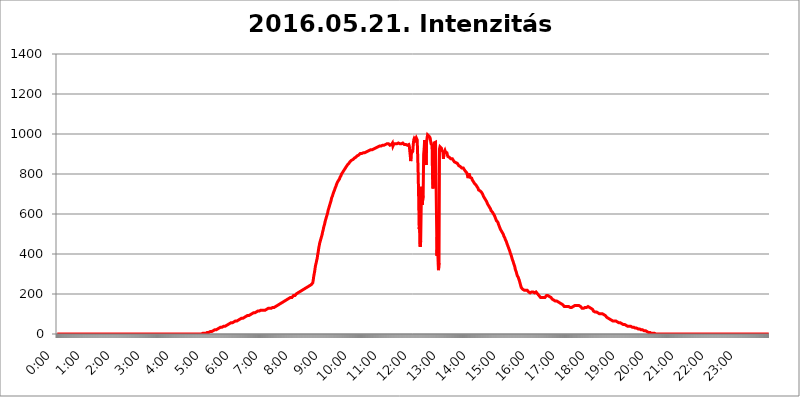
| Category | 2016.05.21. Intenzitás [W/m^2] |
|---|---|
| 0.0 | 0 |
| 0.0006944444444444445 | 0 |
| 0.001388888888888889 | 0 |
| 0.0020833333333333333 | 0 |
| 0.002777777777777778 | 0 |
| 0.003472222222222222 | 0 |
| 0.004166666666666667 | 0 |
| 0.004861111111111111 | 0 |
| 0.005555555555555556 | 0 |
| 0.0062499999999999995 | 0 |
| 0.006944444444444444 | 0 |
| 0.007638888888888889 | 0 |
| 0.008333333333333333 | 0 |
| 0.009027777777777779 | 0 |
| 0.009722222222222222 | 0 |
| 0.010416666666666666 | 0 |
| 0.011111111111111112 | 0 |
| 0.011805555555555555 | 0 |
| 0.012499999999999999 | 0 |
| 0.013194444444444444 | 0 |
| 0.013888888888888888 | 0 |
| 0.014583333333333332 | 0 |
| 0.015277777777777777 | 0 |
| 0.015972222222222224 | 0 |
| 0.016666666666666666 | 0 |
| 0.017361111111111112 | 0 |
| 0.018055555555555557 | 0 |
| 0.01875 | 0 |
| 0.019444444444444445 | 0 |
| 0.02013888888888889 | 0 |
| 0.020833333333333332 | 0 |
| 0.02152777777777778 | 0 |
| 0.022222222222222223 | 0 |
| 0.02291666666666667 | 0 |
| 0.02361111111111111 | 0 |
| 0.024305555555555556 | 0 |
| 0.024999999999999998 | 0 |
| 0.025694444444444447 | 0 |
| 0.02638888888888889 | 0 |
| 0.027083333333333334 | 0 |
| 0.027777777777777776 | 0 |
| 0.02847222222222222 | 0 |
| 0.029166666666666664 | 0 |
| 0.029861111111111113 | 0 |
| 0.030555555555555555 | 0 |
| 0.03125 | 0 |
| 0.03194444444444445 | 0 |
| 0.03263888888888889 | 0 |
| 0.03333333333333333 | 0 |
| 0.034027777777777775 | 0 |
| 0.034722222222222224 | 0 |
| 0.035416666666666666 | 0 |
| 0.036111111111111115 | 0 |
| 0.03680555555555556 | 0 |
| 0.0375 | 0 |
| 0.03819444444444444 | 0 |
| 0.03888888888888889 | 0 |
| 0.03958333333333333 | 0 |
| 0.04027777777777778 | 0 |
| 0.04097222222222222 | 0 |
| 0.041666666666666664 | 0 |
| 0.042361111111111106 | 0 |
| 0.04305555555555556 | 0 |
| 0.043750000000000004 | 0 |
| 0.044444444444444446 | 0 |
| 0.04513888888888889 | 0 |
| 0.04583333333333334 | 0 |
| 0.04652777777777778 | 0 |
| 0.04722222222222222 | 0 |
| 0.04791666666666666 | 0 |
| 0.04861111111111111 | 0 |
| 0.049305555555555554 | 0 |
| 0.049999999999999996 | 0 |
| 0.05069444444444445 | 0 |
| 0.051388888888888894 | 0 |
| 0.052083333333333336 | 0 |
| 0.05277777777777778 | 0 |
| 0.05347222222222222 | 0 |
| 0.05416666666666667 | 0 |
| 0.05486111111111111 | 0 |
| 0.05555555555555555 | 0 |
| 0.05625 | 0 |
| 0.05694444444444444 | 0 |
| 0.057638888888888885 | 0 |
| 0.05833333333333333 | 0 |
| 0.05902777777777778 | 0 |
| 0.059722222222222225 | 0 |
| 0.06041666666666667 | 0 |
| 0.061111111111111116 | 0 |
| 0.06180555555555556 | 0 |
| 0.0625 | 0 |
| 0.06319444444444444 | 0 |
| 0.06388888888888888 | 0 |
| 0.06458333333333334 | 0 |
| 0.06527777777777778 | 0 |
| 0.06597222222222222 | 0 |
| 0.06666666666666667 | 0 |
| 0.06736111111111111 | 0 |
| 0.06805555555555555 | 0 |
| 0.06874999999999999 | 0 |
| 0.06944444444444443 | 0 |
| 0.07013888888888889 | 0 |
| 0.07083333333333333 | 0 |
| 0.07152777777777779 | 0 |
| 0.07222222222222223 | 0 |
| 0.07291666666666667 | 0 |
| 0.07361111111111111 | 0 |
| 0.07430555555555556 | 0 |
| 0.075 | 0 |
| 0.07569444444444444 | 0 |
| 0.0763888888888889 | 0 |
| 0.07708333333333334 | 0 |
| 0.07777777777777778 | 0 |
| 0.07847222222222222 | 0 |
| 0.07916666666666666 | 0 |
| 0.0798611111111111 | 0 |
| 0.08055555555555556 | 0 |
| 0.08125 | 0 |
| 0.08194444444444444 | 0 |
| 0.08263888888888889 | 0 |
| 0.08333333333333333 | 0 |
| 0.08402777777777777 | 0 |
| 0.08472222222222221 | 0 |
| 0.08541666666666665 | 0 |
| 0.08611111111111112 | 0 |
| 0.08680555555555557 | 0 |
| 0.08750000000000001 | 0 |
| 0.08819444444444445 | 0 |
| 0.08888888888888889 | 0 |
| 0.08958333333333333 | 0 |
| 0.09027777777777778 | 0 |
| 0.09097222222222222 | 0 |
| 0.09166666666666667 | 0 |
| 0.09236111111111112 | 0 |
| 0.09305555555555556 | 0 |
| 0.09375 | 0 |
| 0.09444444444444444 | 0 |
| 0.09513888888888888 | 0 |
| 0.09583333333333333 | 0 |
| 0.09652777777777777 | 0 |
| 0.09722222222222222 | 0 |
| 0.09791666666666667 | 0 |
| 0.09861111111111111 | 0 |
| 0.09930555555555555 | 0 |
| 0.09999999999999999 | 0 |
| 0.10069444444444443 | 0 |
| 0.1013888888888889 | 0 |
| 0.10208333333333335 | 0 |
| 0.10277777777777779 | 0 |
| 0.10347222222222223 | 0 |
| 0.10416666666666667 | 0 |
| 0.10486111111111111 | 0 |
| 0.10555555555555556 | 0 |
| 0.10625 | 0 |
| 0.10694444444444444 | 0 |
| 0.1076388888888889 | 0 |
| 0.10833333333333334 | 0 |
| 0.10902777777777778 | 0 |
| 0.10972222222222222 | 0 |
| 0.1111111111111111 | 0 |
| 0.11180555555555556 | 0 |
| 0.11180555555555556 | 0 |
| 0.1125 | 0 |
| 0.11319444444444444 | 0 |
| 0.11388888888888889 | 0 |
| 0.11458333333333333 | 0 |
| 0.11527777777777777 | 0 |
| 0.11597222222222221 | 0 |
| 0.11666666666666665 | 0 |
| 0.1173611111111111 | 0 |
| 0.11805555555555557 | 0 |
| 0.11944444444444445 | 0 |
| 0.12013888888888889 | 0 |
| 0.12083333333333333 | 0 |
| 0.12152777777777778 | 0 |
| 0.12222222222222223 | 0 |
| 0.12291666666666667 | 0 |
| 0.12291666666666667 | 0 |
| 0.12361111111111112 | 0 |
| 0.12430555555555556 | 0 |
| 0.125 | 0 |
| 0.12569444444444444 | 0 |
| 0.12638888888888888 | 0 |
| 0.12708333333333333 | 0 |
| 0.16875 | 0 |
| 0.12847222222222224 | 0 |
| 0.12916666666666668 | 0 |
| 0.12986111111111112 | 0 |
| 0.13055555555555556 | 0 |
| 0.13125 | 0 |
| 0.13194444444444445 | 0 |
| 0.1326388888888889 | 0 |
| 0.13333333333333333 | 0 |
| 0.13402777777777777 | 0 |
| 0.13402777777777777 | 0 |
| 0.13472222222222222 | 0 |
| 0.13541666666666666 | 0 |
| 0.1361111111111111 | 0 |
| 0.13749999999999998 | 0 |
| 0.13819444444444443 | 0 |
| 0.1388888888888889 | 0 |
| 0.13958333333333334 | 0 |
| 0.14027777777777778 | 0 |
| 0.14097222222222222 | 0 |
| 0.14166666666666666 | 0 |
| 0.1423611111111111 | 0 |
| 0.14305555555555557 | 0 |
| 0.14375000000000002 | 0 |
| 0.14444444444444446 | 0 |
| 0.1451388888888889 | 0 |
| 0.1451388888888889 | 0 |
| 0.14652777777777778 | 0 |
| 0.14722222222222223 | 0 |
| 0.14791666666666667 | 0 |
| 0.1486111111111111 | 0 |
| 0.14930555555555555 | 0 |
| 0.15 | 0 |
| 0.15069444444444444 | 0 |
| 0.15138888888888888 | 0 |
| 0.15208333333333332 | 0 |
| 0.15277777777777776 | 0 |
| 0.15347222222222223 | 0 |
| 0.15416666666666667 | 0 |
| 0.15486111111111112 | 0 |
| 0.15555555555555556 | 0 |
| 0.15625 | 0 |
| 0.15694444444444444 | 0 |
| 0.15763888888888888 | 0 |
| 0.15833333333333333 | 0 |
| 0.15902777777777777 | 0 |
| 0.15972222222222224 | 0 |
| 0.16041666666666668 | 0 |
| 0.16111111111111112 | 0 |
| 0.16180555555555556 | 0 |
| 0.1625 | 0 |
| 0.16319444444444445 | 0 |
| 0.1638888888888889 | 0 |
| 0.16458333333333333 | 0 |
| 0.16527777777777777 | 0 |
| 0.16597222222222222 | 0 |
| 0.16666666666666666 | 0 |
| 0.1673611111111111 | 0 |
| 0.16805555555555554 | 0 |
| 0.16874999999999998 | 0 |
| 0.16944444444444443 | 0 |
| 0.17013888888888887 | 0 |
| 0.1708333333333333 | 0 |
| 0.17152777777777775 | 0 |
| 0.17222222222222225 | 0 |
| 0.1729166666666667 | 0 |
| 0.17361111111111113 | 0 |
| 0.17430555555555557 | 0 |
| 0.17500000000000002 | 0 |
| 0.17569444444444446 | 0 |
| 0.1763888888888889 | 0 |
| 0.17708333333333334 | 0 |
| 0.17777777777777778 | 0 |
| 0.17847222222222223 | 0 |
| 0.17916666666666667 | 0 |
| 0.1798611111111111 | 0 |
| 0.18055555555555555 | 0 |
| 0.18125 | 0 |
| 0.18194444444444444 | 0 |
| 0.1826388888888889 | 0 |
| 0.18333333333333335 | 0 |
| 0.1840277777777778 | 0 |
| 0.18472222222222223 | 0 |
| 0.18541666666666667 | 0 |
| 0.18611111111111112 | 0 |
| 0.18680555555555556 | 0 |
| 0.1875 | 0 |
| 0.18819444444444444 | 0 |
| 0.18888888888888888 | 0 |
| 0.18958333333333333 | 0 |
| 0.19027777777777777 | 0 |
| 0.1909722222222222 | 0 |
| 0.19166666666666665 | 0 |
| 0.19236111111111112 | 0 |
| 0.19305555555555554 | 0 |
| 0.19375 | 0 |
| 0.19444444444444445 | 0 |
| 0.1951388888888889 | 0 |
| 0.19583333333333333 | 0 |
| 0.19652777777777777 | 0 |
| 0.19722222222222222 | 0 |
| 0.19791666666666666 | 0 |
| 0.1986111111111111 | 0 |
| 0.19930555555555554 | 0 |
| 0.19999999999999998 | 0 |
| 0.20069444444444443 | 0 |
| 0.20138888888888887 | 0 |
| 0.2020833333333333 | 0 |
| 0.2027777777777778 | 0 |
| 0.2034722222222222 | 3.525 |
| 0.2041666666666667 | 3.525 |
| 0.20486111111111113 | 3.525 |
| 0.20555555555555557 | 3.525 |
| 0.20625000000000002 | 3.525 |
| 0.20694444444444446 | 3.525 |
| 0.2076388888888889 | 3.525 |
| 0.20833333333333334 | 3.525 |
| 0.20902777777777778 | 3.525 |
| 0.20972222222222223 | 3.525 |
| 0.21041666666666667 | 7.887 |
| 0.2111111111111111 | 7.887 |
| 0.21180555555555555 | 7.887 |
| 0.2125 | 7.887 |
| 0.21319444444444444 | 7.887 |
| 0.2138888888888889 | 12.257 |
| 0.21458333333333335 | 12.257 |
| 0.2152777777777778 | 12.257 |
| 0.21597222222222223 | 12.257 |
| 0.21666666666666667 | 12.257 |
| 0.21736111111111112 | 12.257 |
| 0.21805555555555556 | 16.636 |
| 0.21875 | 16.636 |
| 0.21944444444444444 | 16.636 |
| 0.22013888888888888 | 16.636 |
| 0.22083333333333333 | 21.024 |
| 0.22152777777777777 | 21.024 |
| 0.2222222222222222 | 21.024 |
| 0.22291666666666665 | 21.024 |
| 0.2236111111111111 | 21.024 |
| 0.22430555555555556 | 25.419 |
| 0.225 | 25.419 |
| 0.22569444444444445 | 25.419 |
| 0.2263888888888889 | 29.823 |
| 0.22708333333333333 | 29.823 |
| 0.22777777777777777 | 29.823 |
| 0.22847222222222222 | 29.823 |
| 0.22916666666666666 | 34.234 |
| 0.2298611111111111 | 34.234 |
| 0.23055555555555554 | 34.234 |
| 0.23124999999999998 | 34.234 |
| 0.23194444444444443 | 38.653 |
| 0.23263888888888887 | 38.653 |
| 0.2333333333333333 | 38.653 |
| 0.2340277777777778 | 38.653 |
| 0.2347222222222222 | 38.653 |
| 0.2354166666666667 | 38.653 |
| 0.23611111111111113 | 43.079 |
| 0.23680555555555557 | 43.079 |
| 0.23750000000000002 | 43.079 |
| 0.23819444444444446 | 47.511 |
| 0.2388888888888889 | 47.511 |
| 0.23958333333333334 | 47.511 |
| 0.24027777777777778 | 47.511 |
| 0.24097222222222223 | 47.511 |
| 0.24166666666666667 | 51.951 |
| 0.2423611111111111 | 51.951 |
| 0.24305555555555555 | 56.398 |
| 0.24375 | 56.398 |
| 0.24444444444444446 | 56.398 |
| 0.24513888888888888 | 56.398 |
| 0.24583333333333335 | 56.398 |
| 0.2465277777777778 | 60.85 |
| 0.24722222222222223 | 60.85 |
| 0.24791666666666667 | 60.85 |
| 0.24861111111111112 | 60.85 |
| 0.24930555555555556 | 65.31 |
| 0.25 | 65.31 |
| 0.25069444444444444 | 65.31 |
| 0.2513888888888889 | 65.31 |
| 0.2520833333333333 | 65.31 |
| 0.25277777777777777 | 69.775 |
| 0.2534722222222222 | 69.775 |
| 0.25416666666666665 | 69.775 |
| 0.2548611111111111 | 74.246 |
| 0.2555555555555556 | 74.246 |
| 0.25625000000000003 | 74.246 |
| 0.2569444444444445 | 74.246 |
| 0.2576388888888889 | 74.246 |
| 0.25833333333333336 | 78.722 |
| 0.2590277777777778 | 78.722 |
| 0.25972222222222224 | 78.722 |
| 0.2604166666666667 | 78.722 |
| 0.2611111111111111 | 83.205 |
| 0.26180555555555557 | 83.205 |
| 0.2625 | 83.205 |
| 0.26319444444444445 | 83.205 |
| 0.2638888888888889 | 87.692 |
| 0.26458333333333334 | 87.692 |
| 0.2652777777777778 | 87.692 |
| 0.2659722222222222 | 92.184 |
| 0.26666666666666666 | 92.184 |
| 0.2673611111111111 | 92.184 |
| 0.26805555555555555 | 92.184 |
| 0.26875 | 92.184 |
| 0.26944444444444443 | 96.682 |
| 0.2701388888888889 | 96.682 |
| 0.2708333333333333 | 96.682 |
| 0.27152777777777776 | 96.682 |
| 0.2722222222222222 | 101.184 |
| 0.27291666666666664 | 101.184 |
| 0.2736111111111111 | 101.184 |
| 0.2743055555555555 | 101.184 |
| 0.27499999999999997 | 105.69 |
| 0.27569444444444446 | 105.69 |
| 0.27638888888888885 | 101.184 |
| 0.27708333333333335 | 105.69 |
| 0.2777777777777778 | 105.69 |
| 0.27847222222222223 | 110.201 |
| 0.2791666666666667 | 110.201 |
| 0.2798611111111111 | 110.201 |
| 0.28055555555555556 | 110.201 |
| 0.28125 | 114.716 |
| 0.28194444444444444 | 114.716 |
| 0.2826388888888889 | 114.716 |
| 0.2833333333333333 | 114.716 |
| 0.28402777777777777 | 119.235 |
| 0.2847222222222222 | 119.235 |
| 0.28541666666666665 | 119.235 |
| 0.28611111111111115 | 119.235 |
| 0.28680555555555554 | 119.235 |
| 0.28750000000000003 | 119.235 |
| 0.2881944444444445 | 114.716 |
| 0.2888888888888889 | 114.716 |
| 0.28958333333333336 | 119.235 |
| 0.2902777777777778 | 119.235 |
| 0.29097222222222224 | 119.235 |
| 0.2916666666666667 | 119.235 |
| 0.2923611111111111 | 119.235 |
| 0.29305555555555557 | 123.758 |
| 0.29375 | 123.758 |
| 0.29444444444444445 | 123.758 |
| 0.2951388888888889 | 123.758 |
| 0.29583333333333334 | 128.284 |
| 0.2965277777777778 | 128.284 |
| 0.2972222222222222 | 128.284 |
| 0.29791666666666666 | 128.284 |
| 0.2986111111111111 | 128.284 |
| 0.29930555555555555 | 128.284 |
| 0.3 | 128.284 |
| 0.30069444444444443 | 128.284 |
| 0.3013888888888889 | 128.284 |
| 0.3020833333333333 | 132.814 |
| 0.30277777777777776 | 132.814 |
| 0.3034722222222222 | 132.814 |
| 0.30416666666666664 | 132.814 |
| 0.3048611111111111 | 132.814 |
| 0.3055555555555555 | 137.347 |
| 0.30624999999999997 | 137.347 |
| 0.3069444444444444 | 137.347 |
| 0.3076388888888889 | 137.347 |
| 0.30833333333333335 | 141.884 |
| 0.3090277777777778 | 141.884 |
| 0.30972222222222223 | 146.423 |
| 0.3104166666666667 | 146.423 |
| 0.3111111111111111 | 146.423 |
| 0.31180555555555556 | 150.964 |
| 0.3125 | 150.964 |
| 0.31319444444444444 | 155.509 |
| 0.3138888888888889 | 155.509 |
| 0.3145833333333333 | 155.509 |
| 0.31527777777777777 | 160.056 |
| 0.3159722222222222 | 160.056 |
| 0.31666666666666665 | 160.056 |
| 0.31736111111111115 | 164.605 |
| 0.31805555555555554 | 164.605 |
| 0.31875000000000003 | 164.605 |
| 0.3194444444444445 | 164.605 |
| 0.3201388888888889 | 169.156 |
| 0.32083333333333336 | 169.156 |
| 0.3215277777777778 | 169.156 |
| 0.32222222222222224 | 173.709 |
| 0.3229166666666667 | 173.709 |
| 0.3236111111111111 | 173.709 |
| 0.32430555555555557 | 178.264 |
| 0.325 | 178.264 |
| 0.32569444444444445 | 178.264 |
| 0.3263888888888889 | 182.82 |
| 0.32708333333333334 | 182.82 |
| 0.3277777777777778 | 182.82 |
| 0.3284722222222222 | 182.82 |
| 0.32916666666666666 | 182.82 |
| 0.3298611111111111 | 187.378 |
| 0.33055555555555555 | 187.378 |
| 0.33125 | 191.937 |
| 0.33194444444444443 | 191.937 |
| 0.3326388888888889 | 191.937 |
| 0.3333333333333333 | 191.937 |
| 0.3340277777777778 | 196.497 |
| 0.3347222222222222 | 196.497 |
| 0.3354166666666667 | 201.058 |
| 0.3361111111111111 | 201.058 |
| 0.3368055555555556 | 201.058 |
| 0.33749999999999997 | 205.62 |
| 0.33819444444444446 | 205.62 |
| 0.33888888888888885 | 205.62 |
| 0.33958333333333335 | 210.182 |
| 0.34027777777777773 | 210.182 |
| 0.34097222222222223 | 210.182 |
| 0.3416666666666666 | 214.746 |
| 0.3423611111111111 | 214.746 |
| 0.3430555555555555 | 214.746 |
| 0.34375 | 219.309 |
| 0.3444444444444445 | 219.309 |
| 0.3451388888888889 | 223.873 |
| 0.3458333333333334 | 223.873 |
| 0.34652777777777777 | 223.873 |
| 0.34722222222222227 | 228.436 |
| 0.34791666666666665 | 228.436 |
| 0.34861111111111115 | 228.436 |
| 0.34930555555555554 | 233 |
| 0.35000000000000003 | 233 |
| 0.3506944444444444 | 233 |
| 0.3513888888888889 | 237.564 |
| 0.3520833333333333 | 237.564 |
| 0.3527777777777778 | 237.564 |
| 0.3534722222222222 | 237.564 |
| 0.3541666666666667 | 242.127 |
| 0.3548611111111111 | 242.127 |
| 0.35555555555555557 | 242.127 |
| 0.35625 | 246.689 |
| 0.35694444444444445 | 246.689 |
| 0.3576388888888889 | 251.251 |
| 0.35833333333333334 | 255.813 |
| 0.3590277777777778 | 269.49 |
| 0.3597222222222222 | 287.709 |
| 0.36041666666666666 | 301.354 |
| 0.3611111111111111 | 314.98 |
| 0.36180555555555555 | 333.113 |
| 0.3625 | 346.682 |
| 0.36319444444444443 | 355.712 |
| 0.3638888888888889 | 369.23 |
| 0.3645833333333333 | 378.224 |
| 0.3652777777777778 | 396.164 |
| 0.3659722222222222 | 409.574 |
| 0.3666666666666667 | 427.39 |
| 0.3673611111111111 | 440.702 |
| 0.3680555555555556 | 453.968 |
| 0.36874999999999997 | 462.786 |
| 0.36944444444444446 | 471.582 |
| 0.37013888888888885 | 480.356 |
| 0.37083333333333335 | 489.108 |
| 0.37152777777777773 | 497.836 |
| 0.37222222222222223 | 510.885 |
| 0.3729166666666666 | 519.555 |
| 0.3736111111111111 | 532.513 |
| 0.3743055555555555 | 541.121 |
| 0.375 | 549.704 |
| 0.3756944444444445 | 562.53 |
| 0.3763888888888889 | 566.793 |
| 0.3770833333333334 | 579.542 |
| 0.37777777777777777 | 588.009 |
| 0.37847222222222227 | 596.45 |
| 0.37916666666666665 | 604.864 |
| 0.37986111111111115 | 617.436 |
| 0.38055555555555554 | 625.784 |
| 0.38125000000000003 | 634.105 |
| 0.3819444444444444 | 642.4 |
| 0.3826388888888889 | 650.667 |
| 0.3833333333333333 | 658.909 |
| 0.3840277777777778 | 667.123 |
| 0.3847222222222222 | 679.395 |
| 0.3854166666666667 | 683.473 |
| 0.3861111111111111 | 691.608 |
| 0.38680555555555557 | 699.717 |
| 0.3875 | 707.8 |
| 0.38819444444444445 | 711.832 |
| 0.3888888888888889 | 719.877 |
| 0.38958333333333334 | 727.896 |
| 0.3902777777777778 | 731.896 |
| 0.3909722222222222 | 739.877 |
| 0.39166666666666666 | 747.834 |
| 0.3923611111111111 | 751.803 |
| 0.39305555555555555 | 759.723 |
| 0.39375 | 763.674 |
| 0.39444444444444443 | 767.62 |
| 0.3951388888888889 | 771.559 |
| 0.3958333333333333 | 775.492 |
| 0.3965277777777778 | 783.342 |
| 0.3972222222222222 | 787.258 |
| 0.3979166666666667 | 791.169 |
| 0.3986111111111111 | 798.974 |
| 0.3993055555555556 | 802.868 |
| 0.39999999999999997 | 806.757 |
| 0.40069444444444446 | 810.641 |
| 0.40138888888888885 | 814.519 |
| 0.40208333333333335 | 818.392 |
| 0.40277777777777773 | 822.26 |
| 0.40347222222222223 | 826.123 |
| 0.4041666666666666 | 829.981 |
| 0.4048611111111111 | 833.834 |
| 0.4055555555555555 | 837.682 |
| 0.40625 | 841.526 |
| 0.4069444444444445 | 845.365 |
| 0.4076388888888889 | 845.365 |
| 0.4083333333333334 | 849.199 |
| 0.40902777777777777 | 853.029 |
| 0.40972222222222227 | 856.855 |
| 0.41041666666666665 | 860.676 |
| 0.41111111111111115 | 860.676 |
| 0.41180555555555554 | 864.493 |
| 0.41250000000000003 | 868.305 |
| 0.4131944444444444 | 868.305 |
| 0.4138888888888889 | 868.305 |
| 0.4145833333333333 | 872.114 |
| 0.4152777777777778 | 875.918 |
| 0.4159722222222222 | 875.918 |
| 0.4166666666666667 | 879.719 |
| 0.4173611111111111 | 879.719 |
| 0.41805555555555557 | 883.516 |
| 0.41875 | 883.516 |
| 0.41944444444444445 | 887.309 |
| 0.4201388888888889 | 887.309 |
| 0.42083333333333334 | 891.099 |
| 0.4215277777777778 | 891.099 |
| 0.4222222222222222 | 894.885 |
| 0.42291666666666666 | 894.885 |
| 0.4236111111111111 | 898.668 |
| 0.42430555555555555 | 898.668 |
| 0.425 | 902.447 |
| 0.42569444444444443 | 902.447 |
| 0.4263888888888889 | 902.447 |
| 0.4270833333333333 | 902.447 |
| 0.4277777777777778 | 902.447 |
| 0.4284722222222222 | 902.447 |
| 0.4291666666666667 | 906.223 |
| 0.4298611111111111 | 906.223 |
| 0.4305555555555556 | 906.223 |
| 0.43124999999999997 | 906.223 |
| 0.43194444444444446 | 906.223 |
| 0.43263888888888885 | 909.996 |
| 0.43333333333333335 | 909.996 |
| 0.43402777777777773 | 909.996 |
| 0.43472222222222223 | 913.766 |
| 0.4354166666666666 | 913.766 |
| 0.4361111111111111 | 917.534 |
| 0.4368055555555555 | 917.534 |
| 0.4375 | 917.534 |
| 0.4381944444444445 | 921.298 |
| 0.4388888888888889 | 921.298 |
| 0.4395833333333334 | 921.298 |
| 0.44027777777777777 | 921.298 |
| 0.44097222222222227 | 921.298 |
| 0.44166666666666665 | 921.298 |
| 0.44236111111111115 | 925.06 |
| 0.44305555555555554 | 925.06 |
| 0.44375000000000003 | 925.06 |
| 0.4444444444444444 | 925.06 |
| 0.4451388888888889 | 925.06 |
| 0.4458333333333333 | 928.819 |
| 0.4465277777777778 | 928.819 |
| 0.4472222222222222 | 932.576 |
| 0.4479166666666667 | 932.576 |
| 0.4486111111111111 | 928.819 |
| 0.44930555555555557 | 932.576 |
| 0.45 | 936.33 |
| 0.45069444444444445 | 936.33 |
| 0.4513888888888889 | 940.082 |
| 0.45208333333333334 | 940.082 |
| 0.4527777777777778 | 940.082 |
| 0.4534722222222222 | 940.082 |
| 0.45416666666666666 | 940.082 |
| 0.4548611111111111 | 940.082 |
| 0.45555555555555555 | 943.832 |
| 0.45625 | 943.832 |
| 0.45694444444444443 | 943.832 |
| 0.4576388888888889 | 943.832 |
| 0.4583333333333333 | 943.832 |
| 0.4590277777777778 | 943.832 |
| 0.4597222222222222 | 943.832 |
| 0.4604166666666667 | 947.58 |
| 0.4611111111111111 | 947.58 |
| 0.4618055555555556 | 947.58 |
| 0.46249999999999997 | 951.327 |
| 0.46319444444444446 | 951.327 |
| 0.46388888888888885 | 951.327 |
| 0.46458333333333335 | 951.327 |
| 0.46527777777777773 | 947.58 |
| 0.46597222222222223 | 947.58 |
| 0.4666666666666666 | 943.832 |
| 0.4673611111111111 | 943.832 |
| 0.4680555555555555 | 947.58 |
| 0.46875 | 947.58 |
| 0.4694444444444445 | 951.327 |
| 0.4701388888888889 | 955.071 |
| 0.4708333333333334 | 940.082 |
| 0.47152777777777777 | 943.832 |
| 0.47222222222222227 | 951.327 |
| 0.47291666666666665 | 951.327 |
| 0.47361111111111115 | 951.327 |
| 0.47430555555555554 | 951.327 |
| 0.47500000000000003 | 951.327 |
| 0.4756944444444444 | 947.58 |
| 0.4763888888888889 | 951.327 |
| 0.4770833333333333 | 955.071 |
| 0.4777777777777778 | 955.071 |
| 0.4784722222222222 | 955.071 |
| 0.4791666666666667 | 955.071 |
| 0.4798611111111111 | 951.327 |
| 0.48055555555555557 | 951.327 |
| 0.48125 | 955.071 |
| 0.48194444444444445 | 955.071 |
| 0.4826388888888889 | 951.327 |
| 0.48333333333333334 | 947.58 |
| 0.4840277777777778 | 951.327 |
| 0.4847222222222222 | 955.071 |
| 0.48541666666666666 | 951.327 |
| 0.4861111111111111 | 951.327 |
| 0.48680555555555555 | 947.58 |
| 0.4875 | 951.327 |
| 0.48819444444444443 | 951.327 |
| 0.4888888888888889 | 947.58 |
| 0.4895833333333333 | 947.58 |
| 0.4902777777777778 | 943.832 |
| 0.4909722222222222 | 943.832 |
| 0.4916666666666667 | 943.832 |
| 0.4923611111111111 | 943.832 |
| 0.4930555555555556 | 947.58 |
| 0.49374999999999997 | 940.082 |
| 0.49444444444444446 | 943.832 |
| 0.49513888888888885 | 936.33 |
| 0.49583333333333335 | 864.493 |
| 0.49652777777777773 | 921.298 |
| 0.49722222222222223 | 906.223 |
| 0.4979166666666666 | 902.447 |
| 0.4986111111111111 | 913.766 |
| 0.4993055555555555 | 947.58 |
| 0.5 | 970.034 |
| 0.5006944444444444 | 977.508 |
| 0.5013888888888889 | 973.772 |
| 0.5020833333333333 | 970.034 |
| 0.5027777777777778 | 973.772 |
| 0.5034722222222222 | 981.244 |
| 0.5041666666666667 | 984.98 |
| 0.5048611111111111 | 970.034 |
| 0.5055555555555555 | 887.309 |
| 0.50625 | 795.074 |
| 0.5069444444444444 | 671.22 |
| 0.5076388888888889 | 523.88 |
| 0.5083333333333333 | 549.704 |
| 0.5090277777777777 | 436.27 |
| 0.5097222222222222 | 462.786 |
| 0.5104166666666666 | 625.784 |
| 0.5111111111111112 | 735.89 |
| 0.5118055555555555 | 646.537 |
| 0.5125000000000001 | 642.4 |
| 0.5131944444444444 | 691.608 |
| 0.513888888888889 | 898.668 |
| 0.5145833333333333 | 925.06 |
| 0.5152777777777778 | 970.034 |
| 0.5159722222222222 | 868.305 |
| 0.5166666666666667 | 856.855 |
| 0.517361111111111 | 845.365 |
| 0.5180555555555556 | 962.555 |
| 0.5187499999999999 | 981.244 |
| 0.5194444444444445 | 996.182 |
| 0.5201388888888888 | 992.448 |
| 0.5208333333333334 | 992.448 |
| 0.5215277777777778 | 988.714 |
| 0.5222222222222223 | 984.98 |
| 0.5229166666666667 | 981.244 |
| 0.5236111111111111 | 966.295 |
| 0.5243055555555556 | 951.327 |
| 0.525 | 955.071 |
| 0.5256944444444445 | 943.832 |
| 0.5263888888888889 | 779.42 |
| 0.5270833333333333 | 727.896 |
| 0.5277777777777778 | 891.099 |
| 0.5284722222222222 | 955.071 |
| 0.5291666666666667 | 958.814 |
| 0.5298611111111111 | 958.814 |
| 0.5305555555555556 | 958.814 |
| 0.53125 | 955.071 |
| 0.5319444444444444 | 962.555 |
| 0.5326388888888889 | 391.685 |
| 0.5333333333333333 | 519.555 |
| 0.5340277777777778 | 515.223 |
| 0.5347222222222222 | 319.517 |
| 0.5354166666666667 | 355.712 |
| 0.5361111111111111 | 925.06 |
| 0.5368055555555555 | 936.33 |
| 0.5375 | 940.082 |
| 0.5381944444444444 | 936.33 |
| 0.5388888888888889 | 928.819 |
| 0.5395833333333333 | 917.534 |
| 0.5402777777777777 | 917.534 |
| 0.5409722222222222 | 909.996 |
| 0.5416666666666666 | 875.918 |
| 0.5423611111111112 | 906.223 |
| 0.5430555555555555 | 909.996 |
| 0.5437500000000001 | 917.534 |
| 0.5444444444444444 | 909.996 |
| 0.545138888888889 | 909.996 |
| 0.5458333333333333 | 906.223 |
| 0.5465277777777778 | 906.223 |
| 0.5472222222222222 | 894.885 |
| 0.5479166666666667 | 887.309 |
| 0.548611111111111 | 883.516 |
| 0.5493055555555556 | 883.516 |
| 0.5499999999999999 | 883.516 |
| 0.5506944444444445 | 883.516 |
| 0.5513888888888888 | 883.516 |
| 0.5520833333333334 | 875.918 |
| 0.5527777777777778 | 879.719 |
| 0.5534722222222223 | 879.719 |
| 0.5541666666666667 | 875.918 |
| 0.5548611111111111 | 872.114 |
| 0.5555555555555556 | 868.305 |
| 0.55625 | 864.493 |
| 0.5569444444444445 | 860.676 |
| 0.5576388888888889 | 860.676 |
| 0.5583333333333333 | 860.676 |
| 0.5590277777777778 | 856.855 |
| 0.5597222222222222 | 860.676 |
| 0.5604166666666667 | 856.855 |
| 0.5611111111111111 | 853.029 |
| 0.5618055555555556 | 853.029 |
| 0.5625 | 849.199 |
| 0.5631944444444444 | 841.526 |
| 0.5638888888888889 | 837.682 |
| 0.5645833333333333 | 841.526 |
| 0.5652777777777778 | 837.682 |
| 0.5659722222222222 | 837.682 |
| 0.5666666666666667 | 833.834 |
| 0.5673611111111111 | 829.981 |
| 0.5680555555555555 | 829.981 |
| 0.56875 | 829.981 |
| 0.5694444444444444 | 829.981 |
| 0.5701388888888889 | 826.123 |
| 0.5708333333333333 | 822.26 |
| 0.5715277777777777 | 818.392 |
| 0.5722222222222222 | 814.519 |
| 0.5729166666666666 | 810.641 |
| 0.5736111111111112 | 810.641 |
| 0.5743055555555555 | 806.757 |
| 0.5750000000000001 | 806.757 |
| 0.5756944444444444 | 802.868 |
| 0.576388888888889 | 779.42 |
| 0.5770833333333333 | 802.868 |
| 0.5777777777777778 | 798.974 |
| 0.5784722222222222 | 791.169 |
| 0.5791666666666667 | 783.342 |
| 0.579861111111111 | 783.342 |
| 0.5805555555555556 | 779.42 |
| 0.5812499999999999 | 779.42 |
| 0.5819444444444445 | 771.559 |
| 0.5826388888888888 | 767.62 |
| 0.5833333333333334 | 767.62 |
| 0.5840277777777778 | 759.723 |
| 0.5847222222222223 | 759.723 |
| 0.5854166666666667 | 751.803 |
| 0.5861111111111111 | 751.803 |
| 0.5868055555555556 | 747.834 |
| 0.5875 | 743.859 |
| 0.5881944444444445 | 739.877 |
| 0.5888888888888889 | 735.89 |
| 0.5895833333333333 | 731.896 |
| 0.5902777777777778 | 727.896 |
| 0.5909722222222222 | 719.877 |
| 0.5916666666666667 | 719.877 |
| 0.5923611111111111 | 715.858 |
| 0.5930555555555556 | 715.858 |
| 0.59375 | 715.858 |
| 0.5944444444444444 | 711.832 |
| 0.5951388888888889 | 707.8 |
| 0.5958333333333333 | 703.762 |
| 0.5965277777777778 | 699.717 |
| 0.5972222222222222 | 695.666 |
| 0.5979166666666667 | 687.544 |
| 0.5986111111111111 | 683.473 |
| 0.5993055555555555 | 679.395 |
| 0.6 | 675.311 |
| 0.6006944444444444 | 671.22 |
| 0.6013888888888889 | 671.22 |
| 0.6020833333333333 | 663.019 |
| 0.6027777777777777 | 658.909 |
| 0.6034722222222222 | 650.667 |
| 0.6041666666666666 | 646.537 |
| 0.6048611111111112 | 642.4 |
| 0.6055555555555555 | 642.4 |
| 0.6062500000000001 | 634.105 |
| 0.6069444444444444 | 634.105 |
| 0.607638888888889 | 625.784 |
| 0.6083333333333333 | 617.436 |
| 0.6090277777777778 | 613.252 |
| 0.6097222222222222 | 613.252 |
| 0.6104166666666667 | 609.062 |
| 0.611111111111111 | 604.864 |
| 0.6118055555555556 | 600.661 |
| 0.6124999999999999 | 596.45 |
| 0.6131944444444445 | 592.233 |
| 0.6138888888888888 | 588.009 |
| 0.6145833333333334 | 579.542 |
| 0.6152777777777778 | 575.299 |
| 0.6159722222222223 | 566.793 |
| 0.6166666666666667 | 562.53 |
| 0.6173611111111111 | 562.53 |
| 0.6180555555555556 | 558.261 |
| 0.61875 | 549.704 |
| 0.6194444444444445 | 545.416 |
| 0.6201388888888889 | 536.82 |
| 0.6208333333333333 | 532.513 |
| 0.6215277777777778 | 523.88 |
| 0.6222222222222222 | 519.555 |
| 0.6229166666666667 | 515.223 |
| 0.6236111111111111 | 510.885 |
| 0.6243055555555556 | 506.542 |
| 0.625 | 502.192 |
| 0.6256944444444444 | 497.836 |
| 0.6263888888888889 | 489.108 |
| 0.6270833333333333 | 484.735 |
| 0.6277777777777778 | 480.356 |
| 0.6284722222222222 | 471.582 |
| 0.6291666666666667 | 467.187 |
| 0.6298611111111111 | 462.786 |
| 0.6305555555555555 | 453.968 |
| 0.63125 | 449.551 |
| 0.6319444444444444 | 440.702 |
| 0.6326388888888889 | 436.27 |
| 0.6333333333333333 | 427.39 |
| 0.6340277777777777 | 422.943 |
| 0.6347222222222222 | 414.035 |
| 0.6354166666666666 | 405.108 |
| 0.6361111111111112 | 400.638 |
| 0.6368055555555555 | 391.685 |
| 0.6375000000000001 | 387.202 |
| 0.6381944444444444 | 373.729 |
| 0.638888888888889 | 369.23 |
| 0.6395833333333333 | 360.221 |
| 0.6402777777777778 | 351.198 |
| 0.6409722222222222 | 346.682 |
| 0.6416666666666667 | 337.639 |
| 0.642361111111111 | 324.052 |
| 0.6430555555555556 | 319.517 |
| 0.6437499999999999 | 310.44 |
| 0.6444444444444445 | 301.354 |
| 0.6451388888888888 | 292.259 |
| 0.6458333333333334 | 287.709 |
| 0.6465277777777778 | 283.156 |
| 0.6472222222222223 | 278.603 |
| 0.6479166666666667 | 269.49 |
| 0.6486111111111111 | 260.373 |
| 0.6493055555555556 | 251.251 |
| 0.65 | 242.127 |
| 0.6506944444444445 | 233 |
| 0.6513888888888889 | 228.436 |
| 0.6520833333333333 | 228.436 |
| 0.6527777777777778 | 223.873 |
| 0.6534722222222222 | 223.873 |
| 0.6541666666666667 | 219.309 |
| 0.6548611111111111 | 219.309 |
| 0.6555555555555556 | 219.309 |
| 0.65625 | 219.309 |
| 0.6569444444444444 | 219.309 |
| 0.6576388888888889 | 223.873 |
| 0.6583333333333333 | 223.873 |
| 0.6590277777777778 | 219.309 |
| 0.6597222222222222 | 219.309 |
| 0.6604166666666667 | 214.746 |
| 0.6611111111111111 | 210.182 |
| 0.6618055555555555 | 210.182 |
| 0.6625 | 205.62 |
| 0.6631944444444444 | 205.62 |
| 0.6638888888888889 | 210.182 |
| 0.6645833333333333 | 210.182 |
| 0.6652777777777777 | 210.182 |
| 0.6659722222222222 | 210.182 |
| 0.6666666666666666 | 210.182 |
| 0.6673611111111111 | 210.182 |
| 0.6680555555555556 | 210.182 |
| 0.6687500000000001 | 210.182 |
| 0.6694444444444444 | 205.62 |
| 0.6701388888888888 | 210.182 |
| 0.6708333333333334 | 210.182 |
| 0.6715277777777778 | 210.182 |
| 0.6722222222222222 | 210.182 |
| 0.6729166666666666 | 205.62 |
| 0.6736111111111112 | 201.058 |
| 0.6743055555555556 | 201.058 |
| 0.6749999999999999 | 196.497 |
| 0.6756944444444444 | 191.937 |
| 0.6763888888888889 | 191.937 |
| 0.6770833333333334 | 187.378 |
| 0.6777777777777777 | 182.82 |
| 0.6784722222222223 | 182.82 |
| 0.6791666666666667 | 182.82 |
| 0.6798611111111111 | 182.82 |
| 0.6805555555555555 | 182.82 |
| 0.68125 | 182.82 |
| 0.6819444444444445 | 182.82 |
| 0.6826388888888889 | 182.82 |
| 0.6833333333333332 | 182.82 |
| 0.6840277777777778 | 182.82 |
| 0.6847222222222222 | 187.378 |
| 0.6854166666666667 | 187.378 |
| 0.686111111111111 | 191.937 |
| 0.6868055555555556 | 191.937 |
| 0.6875 | 191.937 |
| 0.6881944444444444 | 191.937 |
| 0.688888888888889 | 191.937 |
| 0.6895833333333333 | 191.937 |
| 0.6902777777777778 | 187.378 |
| 0.6909722222222222 | 187.378 |
| 0.6916666666666668 | 187.378 |
| 0.6923611111111111 | 182.82 |
| 0.6930555555555555 | 182.82 |
| 0.69375 | 178.264 |
| 0.6944444444444445 | 173.709 |
| 0.6951388888888889 | 173.709 |
| 0.6958333333333333 | 173.709 |
| 0.6965277777777777 | 169.156 |
| 0.6972222222222223 | 169.156 |
| 0.6979166666666666 | 169.156 |
| 0.6986111111111111 | 164.605 |
| 0.6993055555555556 | 164.605 |
| 0.7000000000000001 | 164.605 |
| 0.7006944444444444 | 164.605 |
| 0.7013888888888888 | 164.605 |
| 0.7020833333333334 | 160.056 |
| 0.7027777777777778 | 160.056 |
| 0.7034722222222222 | 155.509 |
| 0.7041666666666666 | 155.509 |
| 0.7048611111111112 | 155.509 |
| 0.7055555555555556 | 155.509 |
| 0.7062499999999999 | 155.509 |
| 0.7069444444444444 | 150.964 |
| 0.7076388888888889 | 150.964 |
| 0.7083333333333334 | 146.423 |
| 0.7090277777777777 | 146.423 |
| 0.7097222222222223 | 141.884 |
| 0.7104166666666667 | 141.884 |
| 0.7111111111111111 | 137.347 |
| 0.7118055555555555 | 137.347 |
| 0.7125 | 137.347 |
| 0.7131944444444445 | 137.347 |
| 0.7138888888888889 | 137.347 |
| 0.7145833333333332 | 137.347 |
| 0.7152777777777778 | 137.347 |
| 0.7159722222222222 | 137.347 |
| 0.7166666666666667 | 137.347 |
| 0.717361111111111 | 137.347 |
| 0.7180555555555556 | 137.347 |
| 0.71875 | 137.347 |
| 0.7194444444444444 | 132.814 |
| 0.720138888888889 | 132.814 |
| 0.7208333333333333 | 132.814 |
| 0.7215277777777778 | 132.814 |
| 0.7222222222222222 | 137.347 |
| 0.7229166666666668 | 137.347 |
| 0.7236111111111111 | 137.347 |
| 0.7243055555555555 | 137.347 |
| 0.725 | 137.347 |
| 0.7256944444444445 | 141.884 |
| 0.7263888888888889 | 141.884 |
| 0.7270833333333333 | 141.884 |
| 0.7277777777777777 | 141.884 |
| 0.7284722222222223 | 146.423 |
| 0.7291666666666666 | 146.423 |
| 0.7298611111111111 | 141.884 |
| 0.7305555555555556 | 141.884 |
| 0.7312500000000001 | 141.884 |
| 0.7319444444444444 | 141.884 |
| 0.7326388888888888 | 137.347 |
| 0.7333333333333334 | 137.347 |
| 0.7340277777777778 | 137.347 |
| 0.7347222222222222 | 137.347 |
| 0.7354166666666666 | 132.814 |
| 0.7361111111111112 | 128.284 |
| 0.7368055555555556 | 128.284 |
| 0.7374999999999999 | 128.284 |
| 0.7381944444444444 | 128.284 |
| 0.7388888888888889 | 128.284 |
| 0.7395833333333334 | 132.814 |
| 0.7402777777777777 | 132.814 |
| 0.7409722222222223 | 132.814 |
| 0.7416666666666667 | 132.814 |
| 0.7423611111111111 | 132.814 |
| 0.7430555555555555 | 137.347 |
| 0.74375 | 137.347 |
| 0.7444444444444445 | 137.347 |
| 0.7451388888888889 | 137.347 |
| 0.7458333333333332 | 132.814 |
| 0.7465277777777778 | 132.814 |
| 0.7472222222222222 | 132.814 |
| 0.7479166666666667 | 132.814 |
| 0.748611111111111 | 128.284 |
| 0.7493055555555556 | 128.284 |
| 0.75 | 123.758 |
| 0.7506944444444444 | 123.758 |
| 0.751388888888889 | 119.235 |
| 0.7520833333333333 | 114.716 |
| 0.7527777777777778 | 114.716 |
| 0.7534722222222222 | 114.716 |
| 0.7541666666666668 | 110.201 |
| 0.7548611111111111 | 110.201 |
| 0.7555555555555555 | 110.201 |
| 0.75625 | 110.201 |
| 0.7569444444444445 | 105.69 |
| 0.7576388888888889 | 105.69 |
| 0.7583333333333333 | 105.69 |
| 0.7590277777777777 | 105.69 |
| 0.7597222222222223 | 105.69 |
| 0.7604166666666666 | 101.184 |
| 0.7611111111111111 | 101.184 |
| 0.7618055555555556 | 101.184 |
| 0.7625000000000001 | 101.184 |
| 0.7631944444444444 | 101.184 |
| 0.7638888888888888 | 101.184 |
| 0.7645833333333334 | 101.184 |
| 0.7652777777777778 | 101.184 |
| 0.7659722222222222 | 101.184 |
| 0.7666666666666666 | 96.682 |
| 0.7673611111111112 | 96.682 |
| 0.7680555555555556 | 92.184 |
| 0.7687499999999999 | 92.184 |
| 0.7694444444444444 | 87.692 |
| 0.7701388888888889 | 87.692 |
| 0.7708333333333334 | 83.205 |
| 0.7715277777777777 | 83.205 |
| 0.7722222222222223 | 83.205 |
| 0.7729166666666667 | 78.722 |
| 0.7736111111111111 | 78.722 |
| 0.7743055555555555 | 78.722 |
| 0.775 | 74.246 |
| 0.7756944444444445 | 74.246 |
| 0.7763888888888889 | 74.246 |
| 0.7770833333333332 | 69.775 |
| 0.7777777777777778 | 69.775 |
| 0.7784722222222222 | 69.775 |
| 0.7791666666666667 | 65.31 |
| 0.779861111111111 | 65.31 |
| 0.7805555555555556 | 65.31 |
| 0.78125 | 65.31 |
| 0.7819444444444444 | 65.31 |
| 0.782638888888889 | 65.31 |
| 0.7833333333333333 | 65.31 |
| 0.7840277777777778 | 65.31 |
| 0.7847222222222222 | 65.31 |
| 0.7854166666666668 | 60.85 |
| 0.7861111111111111 | 60.85 |
| 0.7868055555555555 | 60.85 |
| 0.7875 | 56.398 |
| 0.7881944444444445 | 56.398 |
| 0.7888888888888889 | 56.398 |
| 0.7895833333333333 | 56.398 |
| 0.7902777777777777 | 56.398 |
| 0.7909722222222223 | 56.398 |
| 0.7916666666666666 | 51.951 |
| 0.7923611111111111 | 51.951 |
| 0.7930555555555556 | 51.951 |
| 0.7937500000000001 | 47.511 |
| 0.7944444444444444 | 47.511 |
| 0.7951388888888888 | 47.511 |
| 0.7958333333333334 | 47.511 |
| 0.7965277777777778 | 47.511 |
| 0.7972222222222222 | 43.079 |
| 0.7979166666666666 | 43.079 |
| 0.7986111111111112 | 43.079 |
| 0.7993055555555556 | 43.079 |
| 0.7999999999999999 | 38.653 |
| 0.8006944444444444 | 38.653 |
| 0.8013888888888889 | 38.653 |
| 0.8020833333333334 | 38.653 |
| 0.8027777777777777 | 38.653 |
| 0.8034722222222223 | 38.653 |
| 0.8041666666666667 | 38.653 |
| 0.8048611111111111 | 38.653 |
| 0.8055555555555555 | 34.234 |
| 0.80625 | 34.234 |
| 0.8069444444444445 | 34.234 |
| 0.8076388888888889 | 34.234 |
| 0.8083333333333332 | 34.234 |
| 0.8090277777777778 | 29.823 |
| 0.8097222222222222 | 29.823 |
| 0.8104166666666667 | 29.823 |
| 0.811111111111111 | 29.823 |
| 0.8118055555555556 | 29.823 |
| 0.8125 | 29.823 |
| 0.8131944444444444 | 25.419 |
| 0.813888888888889 | 25.419 |
| 0.8145833333333333 | 25.419 |
| 0.8152777777777778 | 25.419 |
| 0.8159722222222222 | 25.419 |
| 0.8166666666666668 | 25.419 |
| 0.8173611111111111 | 21.024 |
| 0.8180555555555555 | 21.024 |
| 0.81875 | 21.024 |
| 0.8194444444444445 | 21.024 |
| 0.8201388888888889 | 21.024 |
| 0.8208333333333333 | 21.024 |
| 0.8215277777777777 | 21.024 |
| 0.8222222222222223 | 16.636 |
| 0.8229166666666666 | 16.636 |
| 0.8236111111111111 | 16.636 |
| 0.8243055555555556 | 16.636 |
| 0.8250000000000001 | 16.636 |
| 0.8256944444444444 | 16.636 |
| 0.8263888888888888 | 12.257 |
| 0.8270833333333334 | 12.257 |
| 0.8277777777777778 | 12.257 |
| 0.8284722222222222 | 7.887 |
| 0.8291666666666666 | 7.887 |
| 0.8298611111111112 | 7.887 |
| 0.8305555555555556 | 7.887 |
| 0.8312499999999999 | 7.887 |
| 0.8319444444444444 | 7.887 |
| 0.8326388888888889 | 3.525 |
| 0.8333333333333334 | 3.525 |
| 0.8340277777777777 | 3.525 |
| 0.8347222222222223 | 3.525 |
| 0.8354166666666667 | 3.525 |
| 0.8361111111111111 | 3.525 |
| 0.8368055555555555 | 3.525 |
| 0.8375 | 3.525 |
| 0.8381944444444445 | 3.525 |
| 0.8388888888888889 | 0 |
| 0.8395833333333332 | 0 |
| 0.8402777777777778 | 0 |
| 0.8409722222222222 | 0 |
| 0.8416666666666667 | 0 |
| 0.842361111111111 | 0 |
| 0.8430555555555556 | 0 |
| 0.84375 | 0 |
| 0.8444444444444444 | 0 |
| 0.845138888888889 | 0 |
| 0.8458333333333333 | 0 |
| 0.8465277777777778 | 0 |
| 0.8472222222222222 | 0 |
| 0.8479166666666668 | 0 |
| 0.8486111111111111 | 0 |
| 0.8493055555555555 | 0 |
| 0.85 | 0 |
| 0.8506944444444445 | 0 |
| 0.8513888888888889 | 0 |
| 0.8520833333333333 | 0 |
| 0.8527777777777777 | 0 |
| 0.8534722222222223 | 0 |
| 0.8541666666666666 | 0 |
| 0.8548611111111111 | 0 |
| 0.8555555555555556 | 0 |
| 0.8562500000000001 | 0 |
| 0.8569444444444444 | 0 |
| 0.8576388888888888 | 0 |
| 0.8583333333333334 | 0 |
| 0.8590277777777778 | 0 |
| 0.8597222222222222 | 0 |
| 0.8604166666666666 | 0 |
| 0.8611111111111112 | 0 |
| 0.8618055555555556 | 0 |
| 0.8624999999999999 | 0 |
| 0.8631944444444444 | 0 |
| 0.8638888888888889 | 0 |
| 0.8645833333333334 | 0 |
| 0.8652777777777777 | 0 |
| 0.8659722222222223 | 0 |
| 0.8666666666666667 | 0 |
| 0.8673611111111111 | 0 |
| 0.8680555555555555 | 0 |
| 0.86875 | 0 |
| 0.8694444444444445 | 0 |
| 0.8701388888888889 | 0 |
| 0.8708333333333332 | 0 |
| 0.8715277777777778 | 0 |
| 0.8722222222222222 | 0 |
| 0.8729166666666667 | 0 |
| 0.873611111111111 | 0 |
| 0.8743055555555556 | 0 |
| 0.875 | 0 |
| 0.8756944444444444 | 0 |
| 0.876388888888889 | 0 |
| 0.8770833333333333 | 0 |
| 0.8777777777777778 | 0 |
| 0.8784722222222222 | 0 |
| 0.8791666666666668 | 0 |
| 0.8798611111111111 | 0 |
| 0.8805555555555555 | 0 |
| 0.88125 | 0 |
| 0.8819444444444445 | 0 |
| 0.8826388888888889 | 0 |
| 0.8833333333333333 | 0 |
| 0.8840277777777777 | 0 |
| 0.8847222222222223 | 0 |
| 0.8854166666666666 | 0 |
| 0.8861111111111111 | 0 |
| 0.8868055555555556 | 0 |
| 0.8875000000000001 | 0 |
| 0.8881944444444444 | 0 |
| 0.8888888888888888 | 0 |
| 0.8895833333333334 | 0 |
| 0.8902777777777778 | 0 |
| 0.8909722222222222 | 0 |
| 0.8916666666666666 | 0 |
| 0.8923611111111112 | 0 |
| 0.8930555555555556 | 0 |
| 0.8937499999999999 | 0 |
| 0.8944444444444444 | 0 |
| 0.8951388888888889 | 0 |
| 0.8958333333333334 | 0 |
| 0.8965277777777777 | 0 |
| 0.8972222222222223 | 0 |
| 0.8979166666666667 | 0 |
| 0.8986111111111111 | 0 |
| 0.8993055555555555 | 0 |
| 0.9 | 0 |
| 0.9006944444444445 | 0 |
| 0.9013888888888889 | 0 |
| 0.9020833333333332 | 0 |
| 0.9027777777777778 | 0 |
| 0.9034722222222222 | 0 |
| 0.9041666666666667 | 0 |
| 0.904861111111111 | 0 |
| 0.9055555555555556 | 0 |
| 0.90625 | 0 |
| 0.9069444444444444 | 0 |
| 0.907638888888889 | 0 |
| 0.9083333333333333 | 0 |
| 0.9090277777777778 | 0 |
| 0.9097222222222222 | 0 |
| 0.9104166666666668 | 0 |
| 0.9111111111111111 | 0 |
| 0.9118055555555555 | 0 |
| 0.9125 | 0 |
| 0.9131944444444445 | 0 |
| 0.9138888888888889 | 0 |
| 0.9145833333333333 | 0 |
| 0.9152777777777777 | 0 |
| 0.9159722222222223 | 0 |
| 0.9166666666666666 | 0 |
| 0.9173611111111111 | 0 |
| 0.9180555555555556 | 0 |
| 0.9187500000000001 | 0 |
| 0.9194444444444444 | 0 |
| 0.9201388888888888 | 0 |
| 0.9208333333333334 | 0 |
| 0.9215277777777778 | 0 |
| 0.9222222222222222 | 0 |
| 0.9229166666666666 | 0 |
| 0.9236111111111112 | 0 |
| 0.9243055555555556 | 0 |
| 0.9249999999999999 | 0 |
| 0.9256944444444444 | 0 |
| 0.9263888888888889 | 0 |
| 0.9270833333333334 | 0 |
| 0.9277777777777777 | 0 |
| 0.9284722222222223 | 0 |
| 0.9291666666666667 | 0 |
| 0.9298611111111111 | 0 |
| 0.9305555555555555 | 0 |
| 0.93125 | 0 |
| 0.9319444444444445 | 0 |
| 0.9326388888888889 | 0 |
| 0.9333333333333332 | 0 |
| 0.9340277777777778 | 0 |
| 0.9347222222222222 | 0 |
| 0.9354166666666667 | 0 |
| 0.936111111111111 | 0 |
| 0.9368055555555556 | 0 |
| 0.9375 | 0 |
| 0.9381944444444444 | 0 |
| 0.938888888888889 | 0 |
| 0.9395833333333333 | 0 |
| 0.9402777777777778 | 0 |
| 0.9409722222222222 | 0 |
| 0.9416666666666668 | 0 |
| 0.9423611111111111 | 0 |
| 0.9430555555555555 | 0 |
| 0.94375 | 0 |
| 0.9444444444444445 | 0 |
| 0.9451388888888889 | 0 |
| 0.9458333333333333 | 0 |
| 0.9465277777777777 | 0 |
| 0.9472222222222223 | 0 |
| 0.9479166666666666 | 0 |
| 0.9486111111111111 | 0 |
| 0.9493055555555556 | 0 |
| 0.9500000000000001 | 0 |
| 0.9506944444444444 | 0 |
| 0.9513888888888888 | 0 |
| 0.9520833333333334 | 0 |
| 0.9527777777777778 | 0 |
| 0.9534722222222222 | 0 |
| 0.9541666666666666 | 0 |
| 0.9548611111111112 | 0 |
| 0.9555555555555556 | 0 |
| 0.9562499999999999 | 0 |
| 0.9569444444444444 | 0 |
| 0.9576388888888889 | 0 |
| 0.9583333333333334 | 0 |
| 0.9590277777777777 | 0 |
| 0.9597222222222223 | 0 |
| 0.9604166666666667 | 0 |
| 0.9611111111111111 | 0 |
| 0.9618055555555555 | 0 |
| 0.9625 | 0 |
| 0.9631944444444445 | 0 |
| 0.9638888888888889 | 0 |
| 0.9645833333333332 | 0 |
| 0.9652777777777778 | 0 |
| 0.9659722222222222 | 0 |
| 0.9666666666666667 | 0 |
| 0.967361111111111 | 0 |
| 0.9680555555555556 | 0 |
| 0.96875 | 0 |
| 0.9694444444444444 | 0 |
| 0.970138888888889 | 0 |
| 0.9708333333333333 | 0 |
| 0.9715277777777778 | 0 |
| 0.9722222222222222 | 0 |
| 0.9729166666666668 | 0 |
| 0.9736111111111111 | 0 |
| 0.9743055555555555 | 0 |
| 0.975 | 0 |
| 0.9756944444444445 | 0 |
| 0.9763888888888889 | 0 |
| 0.9770833333333333 | 0 |
| 0.9777777777777777 | 0 |
| 0.9784722222222223 | 0 |
| 0.9791666666666666 | 0 |
| 0.9798611111111111 | 0 |
| 0.9805555555555556 | 0 |
| 0.9812500000000001 | 0 |
| 0.9819444444444444 | 0 |
| 0.9826388888888888 | 0 |
| 0.9833333333333334 | 0 |
| 0.9840277777777778 | 0 |
| 0.9847222222222222 | 0 |
| 0.9854166666666666 | 0 |
| 0.9861111111111112 | 0 |
| 0.9868055555555556 | 0 |
| 0.9874999999999999 | 0 |
| 0.9881944444444444 | 0 |
| 0.9888888888888889 | 0 |
| 0.9895833333333334 | 0 |
| 0.9902777777777777 | 0 |
| 0.9909722222222223 | 0 |
| 0.9916666666666667 | 0 |
| 0.9923611111111111 | 0 |
| 0.9930555555555555 | 0 |
| 0.99375 | 0 |
| 0.9944444444444445 | 0 |
| 0.9951388888888889 | 0 |
| 0.9958333333333332 | 0 |
| 0.9965277777777778 | 0 |
| 0.9972222222222222 | 0 |
| 0.9979166666666667 | 0 |
| 0.998611111111111 | 0 |
| 0.9993055555555556 | 0 |